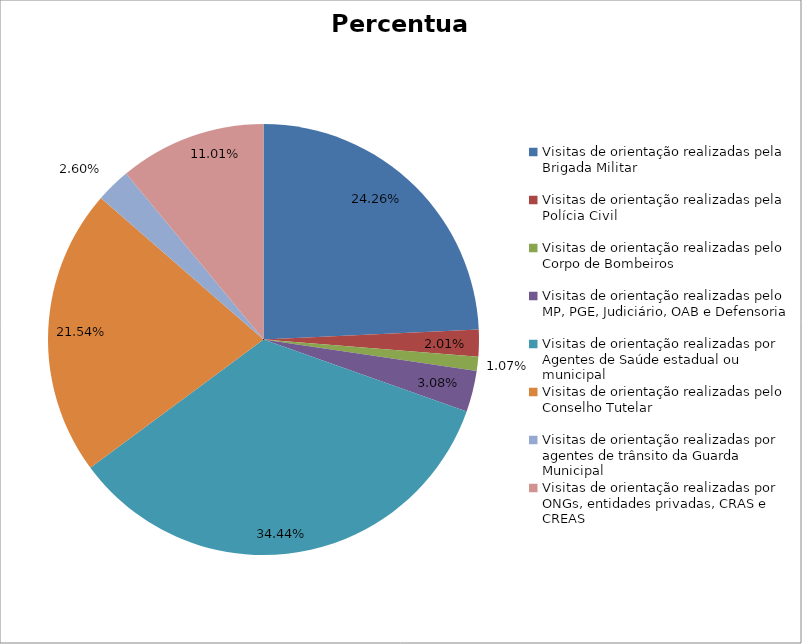
| Category | Percentual |
|---|---|
| Visitas de orientação realizadas pela Brigada Militar | 0.243 |
| Visitas de orientação realizadas pela Polícia Civil | 0.02 |
| Visitas de orientação realizadas pelo Corpo de Bombeiros | 0.011 |
| Visitas de orientação realizadas pelo MP, PGE, Judiciário, OAB e Defensoria | 0.031 |
| Visitas de orientação realizadas por Agentes de Saúde estadual ou municipal | 0.344 |
| Visitas de orientação realizadas pelo Conselho Tutelar | 0.215 |
| Visitas de orientação realizadas por agentes de trânsito da Guarda Municipal | 0.026 |
| Visitas de orientação realizadas por ONGs, entidades privadas, CRAS e CREAS | 0.11 |